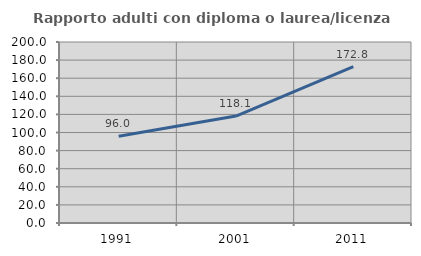
| Category | Rapporto adulti con diploma o laurea/licenza media  |
|---|---|
| 1991.0 | 95.964 |
| 2001.0 | 118.132 |
| 2011.0 | 172.809 |